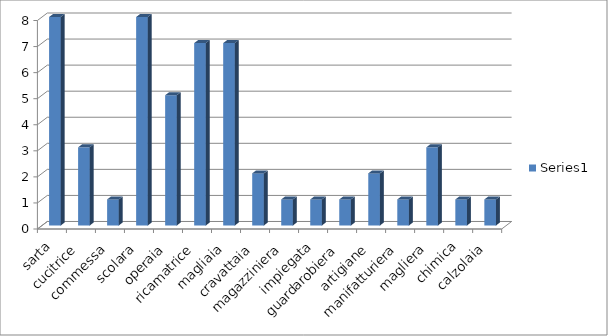
| Category | Series 0 |
|---|---|
| sarta | 8 |
| cucitrice | 3 |
| commessa | 1 |
| scolara | 8 |
| operaia | 5 |
| ricamatrice | 7 |
| magliaia | 7 |
| cravattaia | 2 |
| magazziniera | 1 |
| impiegata | 1 |
| guardarobiera | 1 |
| artigiane | 2 |
| manifatturiera | 1 |
| magliera | 3 |
| chimica | 1 |
| calzolaia | 1 |